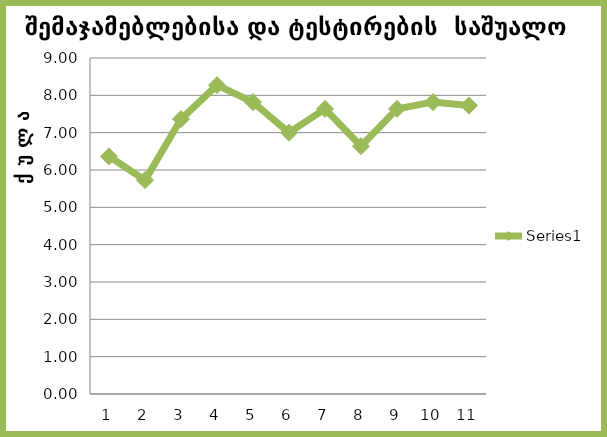
| Category | Series 0 |
|---|---|
| 0 | 6.364 |
| 1 | 5.727 |
| 2 | 7.364 |
| 3 | 8.273 |
| 4 | 7.818 |
| 5 | 7 |
| 6 | 7.636 |
| 7 | 6.636 |
| 8 | 7.636 |
| 9 | 7.818 |
| 10 | 7.727 |